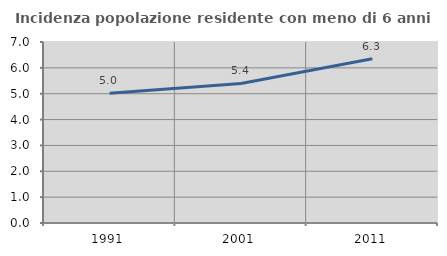
| Category | Incidenza popolazione residente con meno di 6 anni |
|---|---|
| 1991.0 | 5.015 |
| 2001.0 | 5.396 |
| 2011.0 | 6.349 |